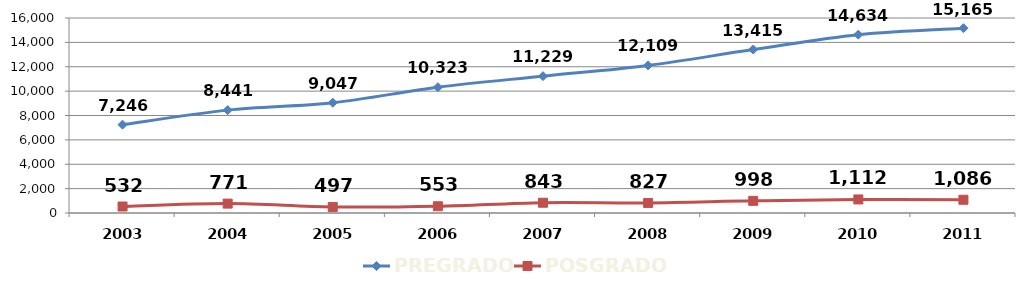
| Category | PREGRADO | POSGRADO |
|---|---|---|
| 2003.0 | 7246 | 532 |
| 2004.0 | 8441 | 771 |
| 2005.0 | 9047 | 497 |
| 2006.0 | 10323 | 553 |
| 2007.0 | 11229 | 843 |
| 2008.0 | 12109 | 827 |
| 2009.0 | 13415 | 998 |
| 2010.0 | 14634 | 1112 |
| 2011.0 | 15165 | 1086 |